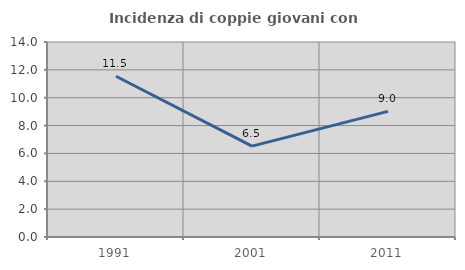
| Category | Incidenza di coppie giovani con figli |
|---|---|
| 1991.0 | 11.538 |
| 2001.0 | 6.522 |
| 2011.0 | 9.016 |